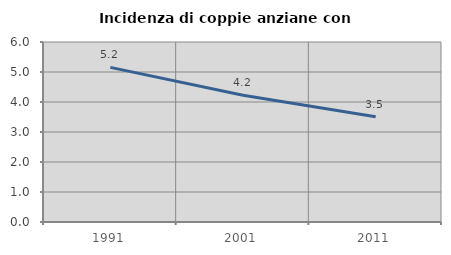
| Category | Incidenza di coppie anziane con figli |
|---|---|
| 1991.0 | 5.155 |
| 2001.0 | 4.225 |
| 2011.0 | 3.509 |